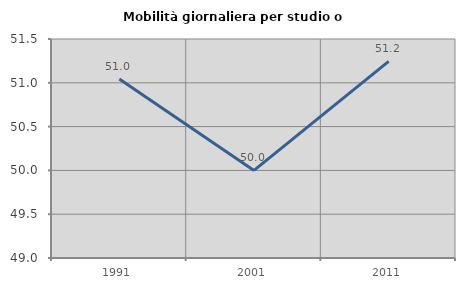
| Category | Mobilità giornaliera per studio o lavoro |
|---|---|
| 1991.0 | 51.043 |
| 2001.0 | 50 |
| 2011.0 | 51.244 |